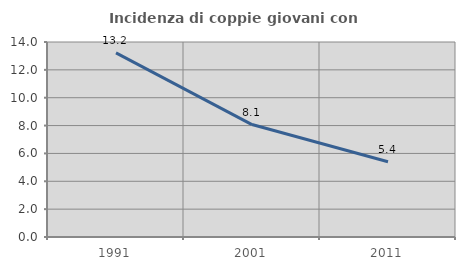
| Category | Incidenza di coppie giovani con figli |
|---|---|
| 1991.0 | 13.219 |
| 2001.0 | 8.073 |
| 2011.0 | 5.401 |